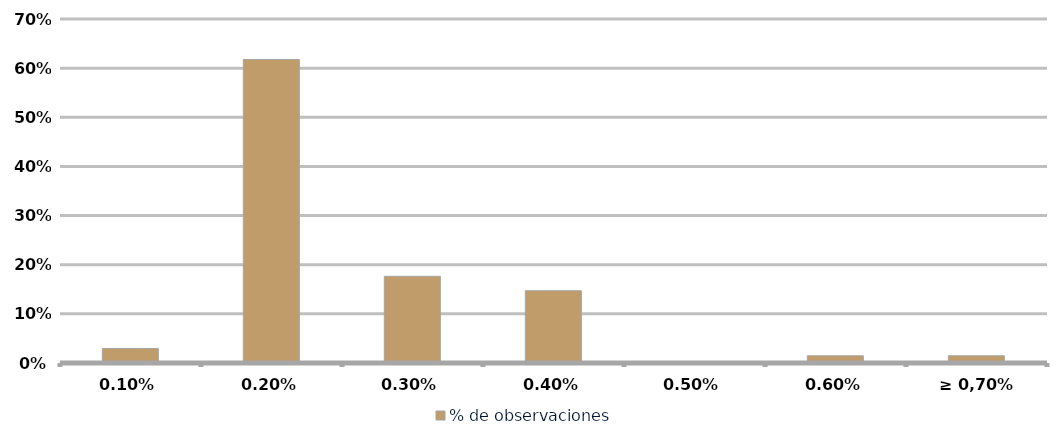
| Category | % de observaciones  |
|---|---|
| 0,10% | 0.029 |
| 0,20% | 0.618 |
| 0,30% | 0.176 |
| 0,40% | 0.147 |
| 0,50% | 0 |
| 0,60% | 0.015 |
| ≥ 0,70% | 0.015 |